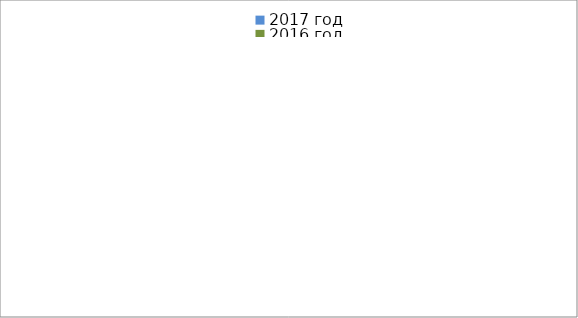
| Category | 2017 год | 2016 год |
|---|---|---|
|  - поджог | 3 | 21 |
|  - неосторожное обращение с огнём | 2 | 14 |
|  - НПТЭ электрооборудования | 5 | 2 |
|  - НПУ и Э печей | 19 | 18 |
|  - НПУ и Э транспортных средств | 29 | 9 |
|   -Шалость с огнем детей | 3 | 4 |
|  -НППБ при эксплуатации эл.приборов | 13 | 4 |
|  - курение | 15 | 3 |
| - прочие | 28 | 37 |
| - не установленные причины | 0 | 11 |